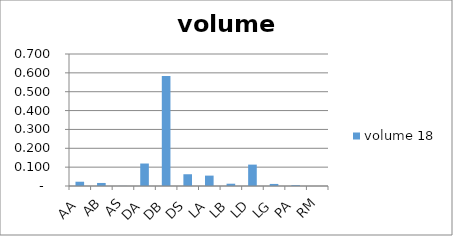
| Category |  volume 18  |
|---|---|
| AA | 0.023 |
| AB | 0.016 |
| AS | 0 |
| DA | 0.119 |
| DB | 0.583 |
| DS | 0.062 |
| LA | 0.055 |
| LB | 0.012 |
| LD | 0.113 |
| LG | 0.011 |
| PA | 0.004 |
| RM | 0 |